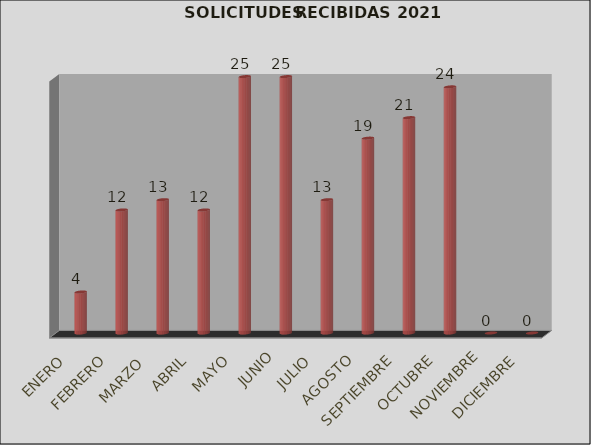
| Category | Series 0 | Series 1 |
|---|---|---|
| ENERO |  | 4 |
| FEBRERO |  | 12 |
| MARZO  |  | 13 |
| ABRIL |  | 12 |
| MAYO |  | 25 |
| JUNIO |  | 25 |
| JULIO |  | 13 |
| AGOSTO |  | 19 |
| SEPTIEMBRE |  | 21 |
| OCTUBRE |  | 24 |
| NOVIEMBRE |  | 0 |
| DICIEMBRE |  | 0 |